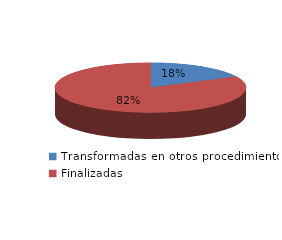
| Category | Series 0 |
|---|---|
| Transformadas en otros procedimientos | 2904 |
| Finalizadas | 13690 |